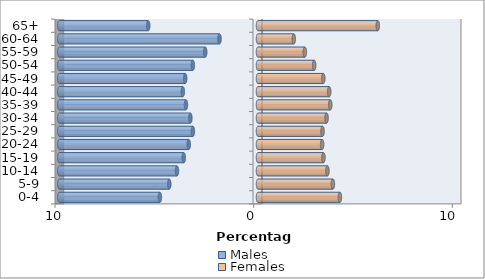
| Category | Males | Females |
|---|---|---|
| 0-4 | -4.939 | 4.122 |
| 5-9 | -4.466 | 3.77 |
| 10-14 | -4.079 | 3.495 |
| 15-19 | -3.736 | 3.294 |
| 20-24 | -3.486 | 3.229 |
| 25-29 | -3.277 | 3.249 |
| 30-34 | -3.403 | 3.452 |
| 35-39 | -3.627 | 3.638 |
| 40-44 | -3.784 | 3.584 |
| 45-49 | -3.664 | 3.289 |
| 50-54 | -3.28 | 2.828 |
| 55-59 | -2.656 | 2.358 |
| 60-64 | -1.937 | 1.802 |
| 65+ | -5.526 | 6.03 |